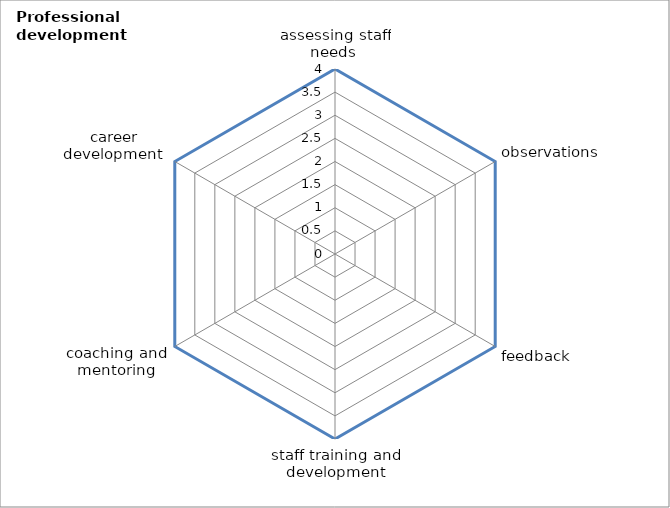
| Category | Series 0 | Series 1 |
|---|---|---|
| assessing staff needs  | 4 |  |
| observations | 4 |  |
| feedback | 4 |  |
| staff training and development | 4 |  |
| coaching and mentoring | 4 |  |
| career development  | 4 |  |